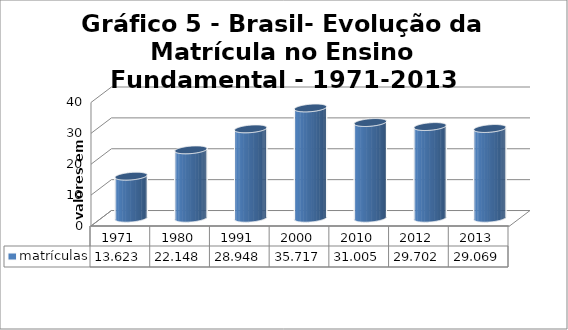
| Category | matrículas |
|---|---|
| 1971.0 | 13.623 |
| 1980.0 | 22.149 |
| 1991.0 | 28.948 |
| 2000.0 | 35.718 |
| 2010.0 | 31.005 |
| 2012.0 | 29.702 |
| 2013.0 | 29.069 |